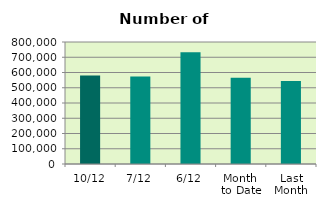
| Category | Series 0 |
|---|---|
| 10/12 | 580144 |
| 7/12 | 574090 |
| 6/12 | 732774 |
| Month 
to Date | 565656 |
| Last
Month | 544187.818 |